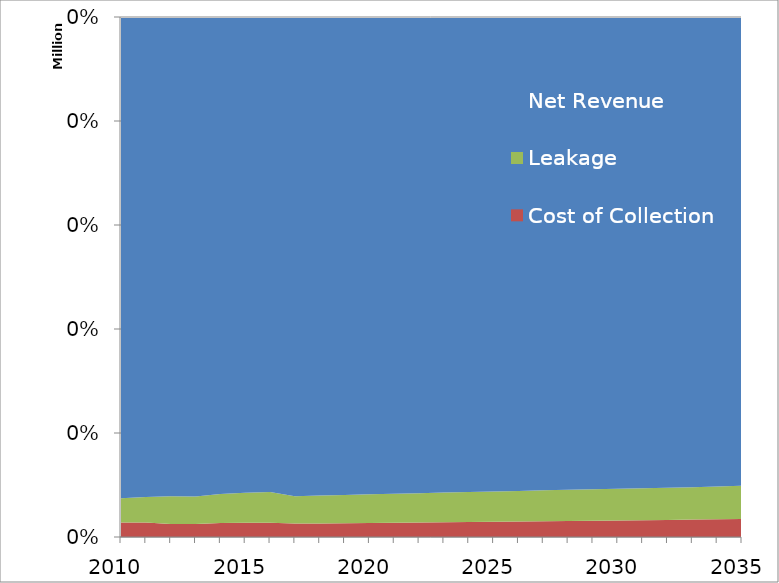
| Category | Cost of Collection | Leakage | Net Revenue |
|---|---|---|---|
| 2010.0 | 37862977.302 | 63411844.09 | 1254378007.538 |
| 2011.0 | 37354386.783 | 65443204.678 | 1233619085.433 |
| 2012.0 | 33625619.598 | 71308793.485 | 1238082815.553 |
| 2013.0 | 33671337.897 | 71701459.287 | 1246642876.277 |
| 2014.0 | 36756848.485 | 77088808.399 | 1259075659.571 |
| 2015.0 | 37197136.158 | 78942626.569 | 1246802988.976 |
| 2016.0 | 37895358.738 | 80622980.688 | 1252858731.281 |
| 2017.0 | 43059967.145 | 88189315.543 | 1542449388.12 |
| 2018.0 | 43700275.432 | 89899545.213 | 1541901459.102 |
| 2019.0 | 44364913.3 | 91328336.944 | 1541432468.464 |
| 2020.0 | 45045375.662 | 92632255.861 | 1540445043.927 |
| 2021.0 | 45729732.717 | 93803611.952 | 1538165515.372 |
| 2022.0 | 46424177.725 | 94872729.994 | 1535090457.51 |
| 2023.0 | 47132873.51 | 95860282.283 | 1531537609.794 |
| 2024.0 | 47855205.415 | 96774884.958 | 1527359634.631 |
| 2025.0 | 48594584.534 | 97626743.731 | 1522698800.078 |
| 2026.0 | 49365558.198 | 98439514.477 | 1518506237.931 |
| 2027.0 | 50174181.367 | 99224968.906 | 1515086686.743 |
| 2028.0 | 51020377.969 | 99987416.709 | 1512311981.456 |
| 2029.0 | 51905746.883 | 100731638.657 | 1510292721.926 |
| 2030.0 | 52832175.181 | 101465129.862 | 1509160332.46 |
| 2031.0 | 53798601.714 | 102187788.333 | 1508740450.145 |
| 2032.0 | 54807485.455 | 102903872.048 | 1509184983.687 |
| 2033.0 | 55849495.61 | 104356918.881 | 1510404988.322 |
| 2034.0 | 56932834.023 | 105854945.083 | 1512325229.538 |
| 2035.0 | 58058393.322 | 107397960.17 | 1514938292.092 |